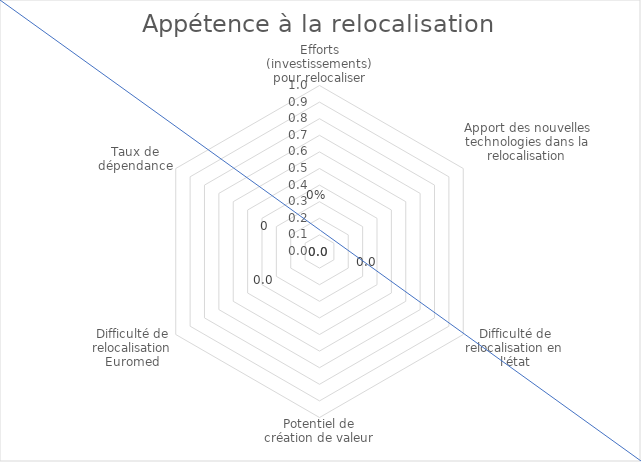
| Category | Series 0 |
|---|---|
| Efforts (investissements) pour relocaliser | 0 |
| Apport des nouvelles technologies dans la relocalisation | 0 |
| Difficulté de relocalisation en l'état | 0 |
| Potentiel de création de valeur | 0 |
| Difficulté de relocalisation Euromed | 0 |
| Taux de dépendance | 0 |